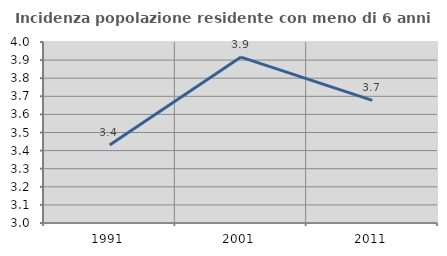
| Category | Incidenza popolazione residente con meno di 6 anni |
|---|---|
| 1991.0 | 3.431 |
| 2001.0 | 3.917 |
| 2011.0 | 3.677 |